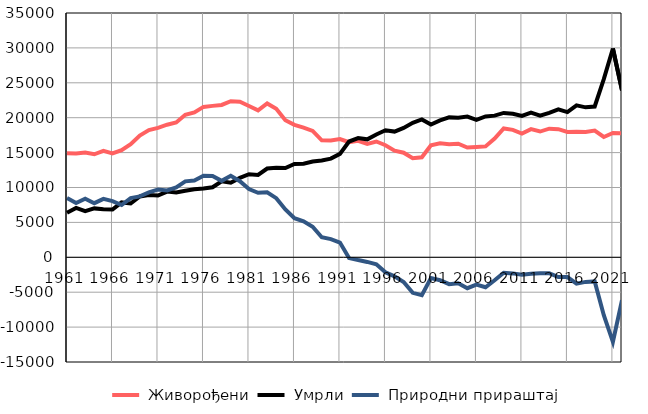
| Category |  Живорођени |  Умрли |  Природни прираштај |
|---|---|---|---|
| 1961.0 | 14900 | 6390 | 8510 |
| 1962.0 | 14865 | 7082 | 7783 |
| 1963.0 | 15020 | 6624 | 8396 |
| 1964.0 | 14760 | 7006 | 7754 |
| 1965.0 | 15251 | 6882 | 8369 |
| 1966.0 | 14885 | 6834 | 8051 |
| 1967.0 | 15353 | 7860 | 7493 |
| 1968.0 | 16198 | 7711 | 8487 |
| 1969.0 | 17447 | 8718 | 8729 |
| 1970.0 | 18221 | 8910 | 9311 |
| 1971.0 | 18550 | 8850 | 9700 |
| 1972.0 | 18997 | 9409 | 9588 |
| 1973.0 | 19312 | 9301 | 10011 |
| 1974.0 | 20412 | 9532 | 10880 |
| 1975.0 | 20746 | 9740 | 11006 |
| 1976.0 | 21546 | 9867 | 11679 |
| 1977.0 | 21693 | 10039 | 11654 |
| 1978.0 | 21830 | 10879 | 10951 |
| 1979.0 | 22361 | 10687 | 11674 |
| 1980.0 | 22277 | 11374 | 10903 |
| 1981.0 | 21671 | 11904 | 9767 |
| 1982.0 | 21049 | 11808 | 9241 |
| 1983.0 | 22047 | 12721 | 9326 |
| 1984.0 | 21280 | 12812 | 8468 |
| 1985.0 | 19645 | 12783 | 6862 |
| 1986.0 | 18980 | 13380 | 5600 |
| 1987.0 | 18580 | 13418 | 5162 |
| 1988.0 | 18106 | 13719 | 4387 |
| 1989.0 | 16756 | 13881 | 2875 |
| 1990.0 | 16740 | 14137 | 2603 |
| 1991.0 | 16942 | 14824 | 2118 |
| 1992.0 | 16496 | 16589 | -93 |
| 1993.0 | 16685 | 17084 | -399 |
| 1994.0 | 16238 | 16901 | -663 |
| 1995.0 | 16590 | 17586 | -996 |
| 1996.0 | 16052 | 18197 | -2145 |
| 1997.0 | 15284 | 18012 | -2728 |
| 1998.0 | 14987 | 18533 | -3546 |
| 1999.0 | 14182 | 19274 | -5092 |
| 2000.0 | 14324 | 19758 | -5434 |
| 2001.0 | 16059 | 19025 | -2966 |
| 2002.0 | 16342 | 19621 | -3279 |
| 2003.0 | 16200 | 20045 | -3845 |
| 2004.0 | 16276 | 19993 | -3717 |
| 2005.0 | 15727 | 20155 | -4428 |
| 2006.0 | 15802 | 19703 | -3901 |
| 2007.0 | 15887 | 20174 | -4287 |
| 2008.0 | 17000 | 20294 | -3294 |
| 2009.0 | 18463 | 20682 | -2219 |
| 2010.0 | 18262 | 20566 | -2304 |
| 2011.0 | 17738 | 20246 | -2508 |
| 2012.0 | 18362 | 20725 | -2363 |
| 2013.0 | 18018 | 20288 | -2270 |
| 2014.0 | 18427 | 20698 | -2271 |
| 2015.0 | 18356 | 21196 | -2840 |
| 2016.0 | 17967 | 20803 | -2836 |
| 2017.0 | 18000 | 21768 | -3768 |
| 2018.0 | 17959 | 21484 | -3525 |
| 2019.0 | 18153 | 21604 | -3451 |
| 2020.0 | 17236 | 25526 | -8290 |
| 2021.0 | 17803 | 29917 | -12114 |
| 2022.0 | 17753 | 23912 | -6159 |